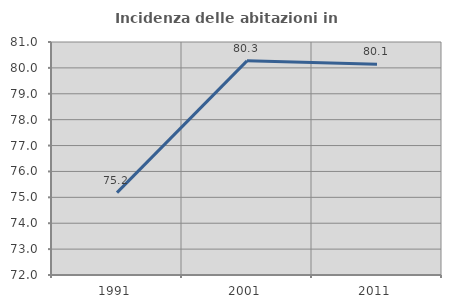
| Category | Incidenza delle abitazioni in proprietà  |
|---|---|
| 1991.0 | 75.182 |
| 2001.0 | 80.272 |
| 2011.0 | 80.142 |